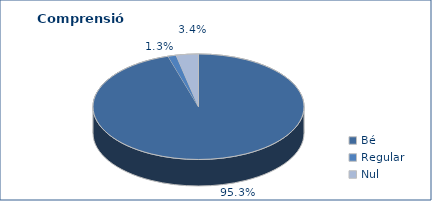
| Category | Series 0 |
|---|---|
| Bé | 5336 |
| Regular | 70 |
| Nul | 191 |